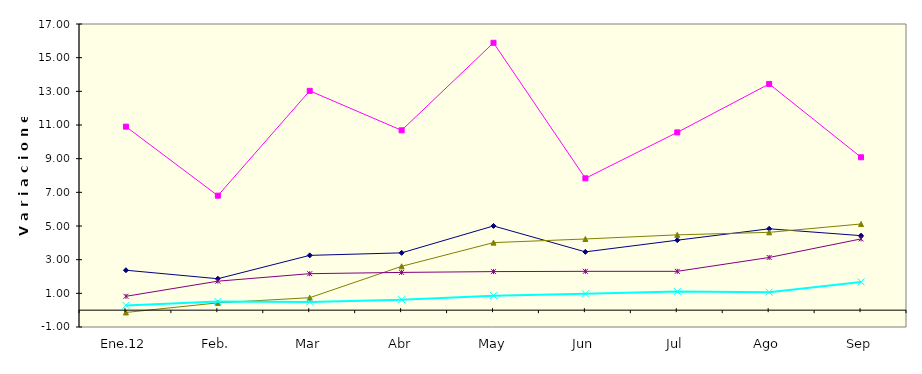
| Category | Series 0 | Series 1 | Series 2 | Series 3 | Series 4 |
|---|---|---|---|---|---|
| Ene.12 | 2.373 | 10.902 | -0.135 | 0.284 | 0.823 |
| Feb. | 1.868 | 6.801 | 0.434 | 0.518 | 1.722 |
| Mar | 3.256 | 13.031 | 0.741 | 0.483 | 2.167 |
| Abr | 3.405 | 10.684 | 2.605 | 0.622 | 2.242 |
| May | 5.003 | 15.884 | 4.012 | 0.861 | 2.291 |
| Jun | 3.464 | 7.832 | 4.229 | 0.968 | 2.306 |
| Jul | 4.157 | 10.561 | 4.474 | 1.108 | 2.306 |
| Ago | 4.833 | 13.439 | 4.623 | 1.065 | 3.13 |
| Sep | 4.428 | 9.082 | 5.119 | 1.68 | 4.233 |